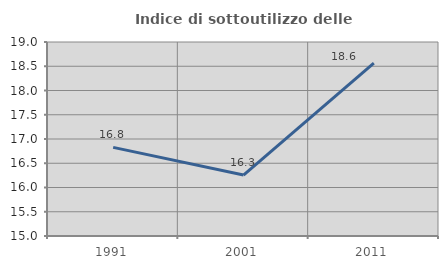
| Category | Indice di sottoutilizzo delle abitazioni  |
|---|---|
| 1991.0 | 16.827 |
| 2001.0 | 16.256 |
| 2011.0 | 18.565 |